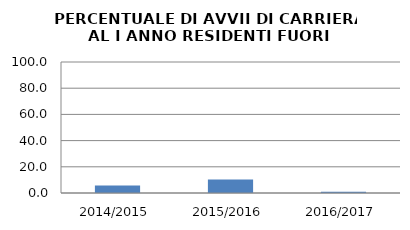
| Category | 2014/2015 2015/2016 2016/2017 |
|---|---|
| 2014/2015 | 5.691 |
| 2015/2016 | 10.317 |
| 2016/2017 | 0.935 |